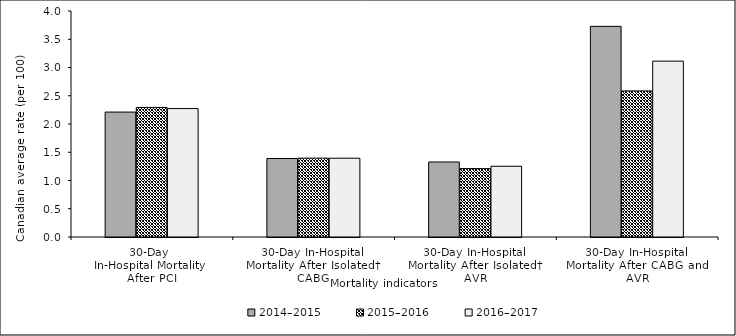
| Category | 2014–2015 | 2015–2016 | 2016–2017 |
|---|---|---|---|
| 30-Day 
In-Hospital Mortality
After PCI | 2.211 | 2.293 | 2.273 |
| 30-Day In-Hospital Mortality After Isolated† CABG | 1.39 | 1.396 | 1.394 |
| 30-Day In-Hospital Mortality After Isolated† AVR | 1.328 | 1.211 | 1.252 |
| 30-Day In-Hospital Mortality After CABG and AVR | 3.729 | 2.586 | 3.112 |